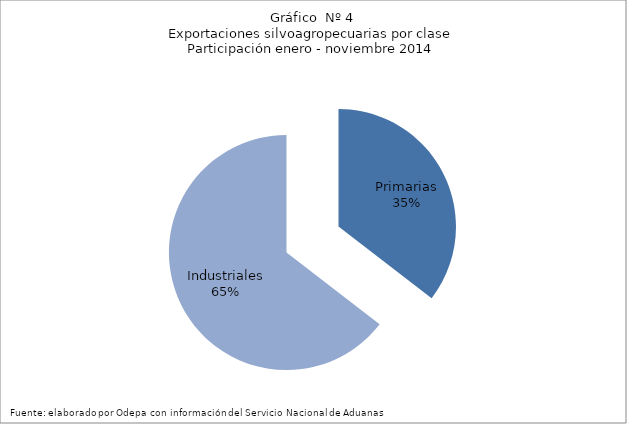
| Category | Series 0 |
|---|---|
| Primarias | 5138130 |
| Industriales | 9361484 |